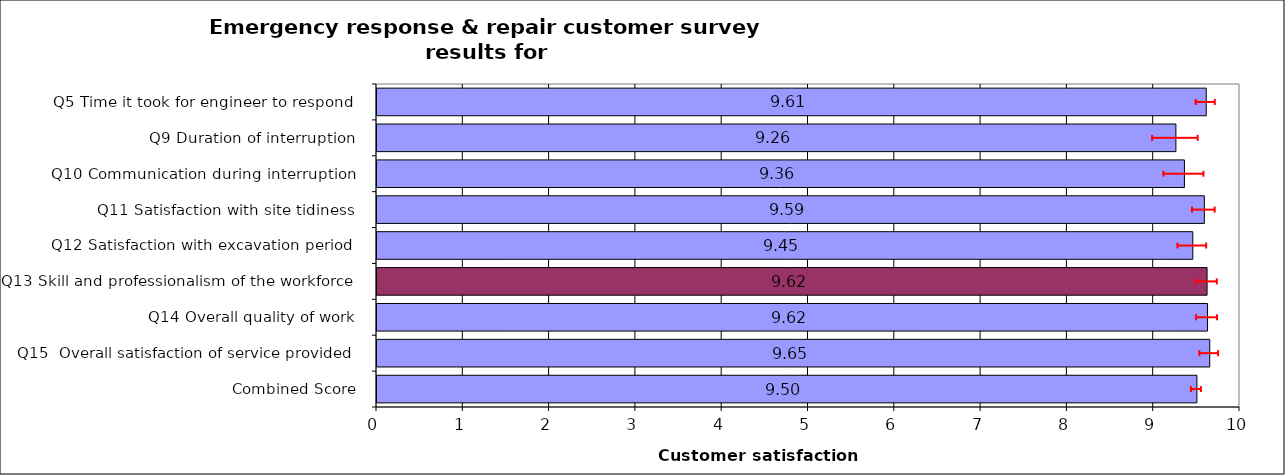
| Category | Series 0 |
|---|---|
| Q5 Time it took for engineer to respond | 9.609 |
| Q9 Duration of interruption | 9.257 |
| Q10 Communication during interruption | 9.356 |
| Q11 Satisfaction with site tidiness | 9.587 |
| Q12 Satisfaction with excavation period | 9.453 |
| Q13 Skill and professionalism of the workforce | 9.618 |
| Q14 Overall quality of work | 9.624 |
| Q15  Overall satisfaction of service provided | 9.649 |
| Combined Score | 9.501 |